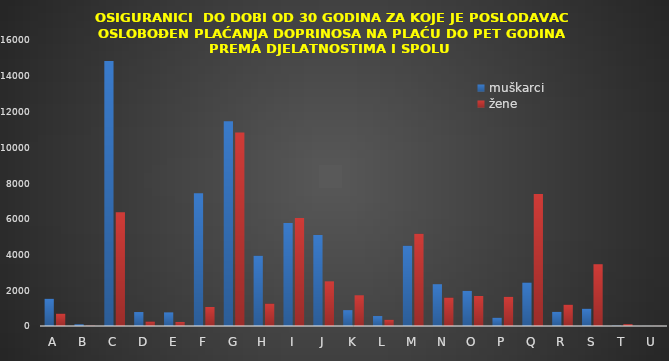
| Category | muškarci | žene |
|---|---|---|
| A | 1523 | 690 |
| B | 95 | 17 |
| C | 14826 | 6362 |
| D | 781 | 251 |
| E | 762 | 226 |
| F | 7427 | 1064 |
| G | 11452 | 10831 |
| H | 3931 | 1253 |
| I | 5756 | 6043 |
| J | 5086 | 2498 |
| K | 886 | 1718 |
| L | 557 | 348 |
| M | 4490 | 5156 |
| N | 2338 | 1594 |
| O | 1964 | 1678 |
| P | 462 | 1631 |
| Q | 2433 | 7384 |
| R | 791 | 1191 |
| S | 966 | 3456 |
| T | 17 | 103 |
| U | 3 | 5 |